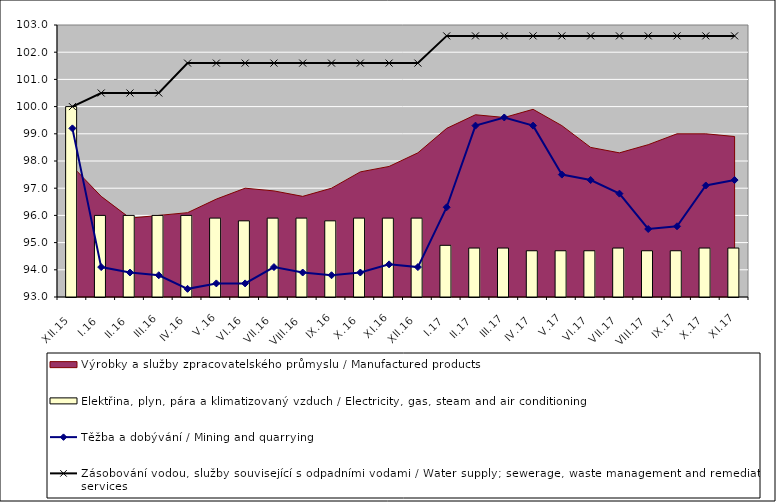
| Category | Elektřina, plyn, pára a klimatizovaný vzduch / Electricity, gas, steam and air conditioning |
|---|---|
| XII.15 | 100 |
| I.16 | 96 |
| II.16 | 96 |
| III.16 | 96 |
| IV.16 | 96 |
| V.16 | 95.9 |
| VI.16 | 95.8 |
| VII.16 | 95.9 |
| VIII.16 | 95.9 |
| IX.16 | 95.8 |
| X.16 | 95.9 |
| XI.16 | 95.9 |
| XII.16 | 95.9 |
| I.17 | 94.9 |
| II.17 | 94.8 |
| III.17 | 94.8 |
| IV.17 | 94.7 |
| V.17 | 94.7 |
| VI.17 | 94.7 |
| VII.17 | 94.8 |
| VIII.17 | 94.7 |
| IX.17 | 94.7 |
| X.17 | 94.8 |
| XI.17 | 94.8 |